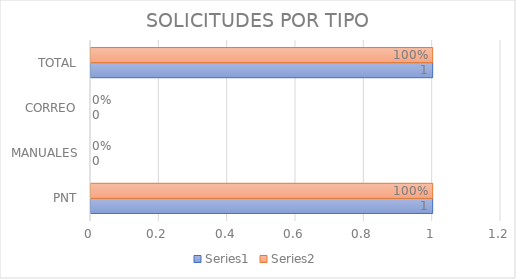
| Category | Series 0 | Series 1 |
|---|---|---|
| PNT | 1 | 1 |
| MANUALES | 0 | 0 |
| CORREO | 0 | 0 |
| TOTAL | 1 | 1 |